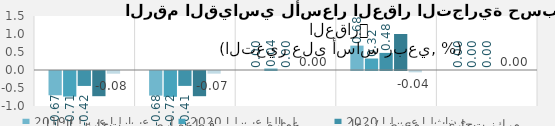
| Category | 2019 | 2020 |
|---|---|---|
| تجاري، الكل | -0.674 | -0.075 |
| قطعة أرض | -0.684 | -0.074 |
| عمارة | 0 | 0 |
| معرض / محل | 0.677 | -0.038 |
| مركز تجاري | 0 | 0 |